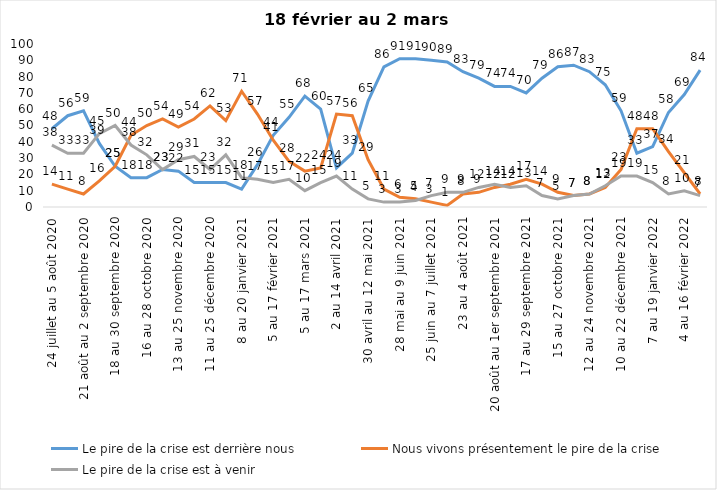
| Category | Le pire de la crise est derrière nous | Nous vivons présentement le pire de la crise | Le pire de la crise est à venir |
|---|---|---|---|
| 24 juillet au 5 août 2020 | 48 | 14 | 38 |
| 7 au 19 août 2020 | 56 | 11 | 33 |
| 21 août au 2 septembre 2020 | 59 | 8 | 33 |
| 4 au 16 septembre 2020 | 39 | 16 | 45 |
| 18 au 30 septembre 2020 | 25 | 25 | 50 |
| 2 au 14 octobre 2020 | 18 | 44 | 38 |
| 16 au 28 octobre 2020 | 18 | 50 | 32 |
| 30 octobre au 11 novembre 2020 | 23 | 54 | 23 |
| 13 au 25 novembre 2020 | 22 | 49 | 29 |
| 27 au 9 décembre 2020 | 15 | 54 | 31 |
| 11 au 25 décembre 2020 | 15 | 62 | 23 |
| 25 décembre 2020 au 6 janvier 2021 | 15 | 53 | 32 |
| 8 au 20 janvier 2021 | 11 | 71 | 18 |
| 22 janvier au 3 février 2021 | 26 | 57 | 17 |
| 5 au 17 février 2021 | 44 | 41 | 15 |
| 19 février au 3 mars 2021 | 55 | 28 | 17 |
| 5 au 17 mars 2021 | 68 | 22 | 10 |
| 19 au 31 mars 2021 | 60 | 24 | 15 |
| 2 au 14 avril 2021 | 24 | 57 | 19 |
| 16 au 28 avril 2021 | 33 | 56 | 11 |
| 30 avril au 12 mai 2021 | 65 | 29 | 5 |
| 14 au 26 mai 2021 | 86 | 11 | 3 |
| 28 mai au 9 juin 2021 | 91 | 6 | 3 |
| 11 au 23 juin 2021 | 91 | 5 | 4 |
| 25 juin au 7 juillet 2021 | 90 | 3 | 7 |
| 9 au 21 juillet 2021 | 89 | 1 | 9 |
| 23 au 4 août 2021 | 83 | 8 | 9 |
| 6 au 18 août 2021 | 79 | 9 | 12 |
| 20 août au 1er septembre 2021 | 74 | 12 | 14 |
| 3 au 15 septembre 2021 | 74 | 14 | 12 |
| 17 au 29 septembre 2021 | 70 | 17 | 13 |
| 1 au 13 octobre 2021 | 79 | 14 | 7 |
| 15 au 27 octobre 2021 | 86 | 9 | 5 |
| 29 octobre au 10 novembre 2021 | 87 | 7 | 7 |
| 12 au 24 novembre 2021 | 83 | 8 | 8 |
| 26 novembre au 8 décembre 2021 | 75 | 12 | 13 |
| 10 au 22 décembre 2021 | 59 | 23 | 19 |
| 24 décembre 2021 au 5 janvier 2022 | 33 | 48 | 19 |
| 7 au 19 janvier 2022 | 37 | 48 | 15 |
| 21 janvier au 2 février 2022 | 58 | 34 | 8 |
| 4 au 16 février 2022 | 69 | 21 | 10 |
| 18 février au 2 mars  2022 | 84 | 8 | 7 |